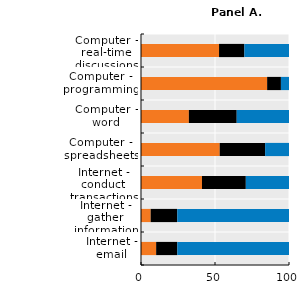
| Category | Never | Less than once a week | At least once a week |
|---|---|---|---|
| Internet - email | 10.24 | 14.3 | 75.46 |
| Internet - gather information | 6.535 | 17.972 | 75.493 |
| Internet - conduct transactions | 41.205 | 29.62 | 29.175 |
| Computer - spreadsheets | 53.182 | 30.689 | 16.13 |
| Computer - word | 32.346 | 32.329 | 35.325 |
| Computer - programming | 85.23 | 9.314 | 5.456 |
| Computer - real-time discussions | 52.737 | 17.109 | 30.154 |